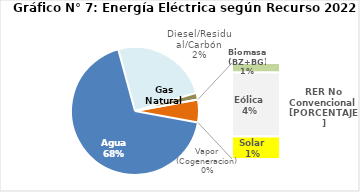
| Category | Series 0 |
|---|---|
| Agua | 3217.054 |
| Gas Natural | 1166.812 |
| Diesel/Residual/Carbón | 81.091 |
| Vapor (Cogeneracion) | 0.153 |
| Biomasa (BZ+BG) | 27.148 |
| Eólica | 182.982 |
| Solar | 64.08 |